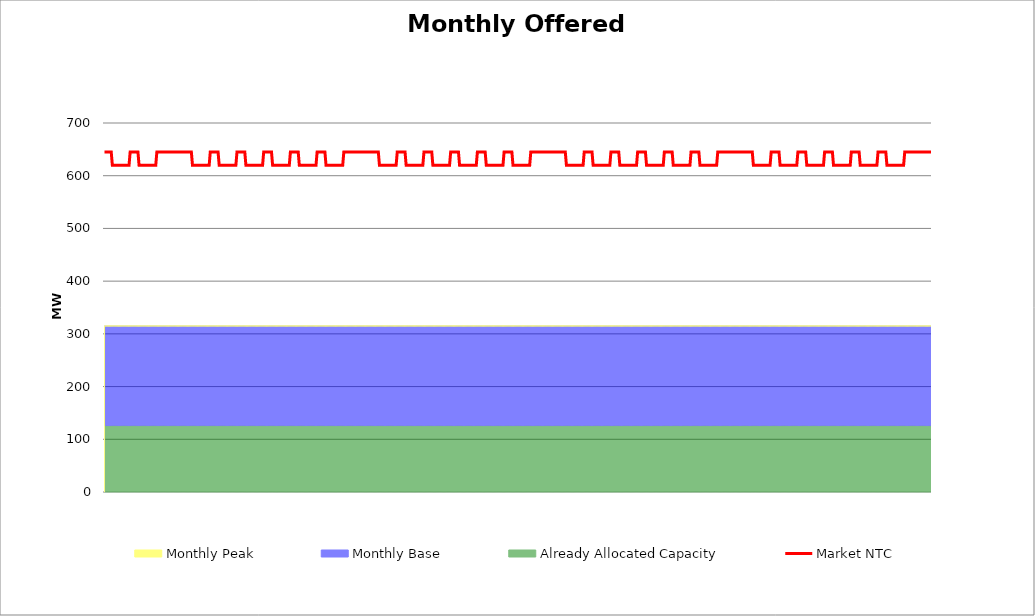
| Category | Market NTC |
|---|---|
| 0 | 645 |
| 1 | 645 |
| 2 | 645 |
| 3 | 645 |
| 4 | 645 |
| 5 | 645 |
| 6 | 645 |
| 7 | 620 |
| 8 | 620 |
| 9 | 620 |
| 10 | 620 |
| 11 | 620 |
| 12 | 620 |
| 13 | 620 |
| 14 | 620 |
| 15 | 620 |
| 16 | 620 |
| 17 | 620 |
| 18 | 620 |
| 19 | 620 |
| 20 | 620 |
| 21 | 620 |
| 22 | 620 |
| 23 | 645 |
| 24 | 645 |
| 25 | 645 |
| 26 | 645 |
| 27 | 645 |
| 28 | 645 |
| 29 | 645 |
| 30 | 645 |
| 31 | 620 |
| 32 | 620 |
| 33 | 620 |
| 34 | 620 |
| 35 | 620 |
| 36 | 620 |
| 37 | 620 |
| 38 | 620 |
| 39 | 620 |
| 40 | 620 |
| 41 | 620 |
| 42 | 620 |
| 43 | 620 |
| 44 | 620 |
| 45 | 620 |
| 46 | 620 |
| 47 | 645 |
| 48 | 645 |
| 49 | 645 |
| 50 | 645 |
| 51 | 645 |
| 52 | 645 |
| 53 | 645 |
| 54 | 645 |
| 55 | 645 |
| 56 | 645 |
| 57 | 645 |
| 58 | 645 |
| 59 | 645 |
| 60 | 645 |
| 61 | 645 |
| 62 | 645 |
| 63 | 645 |
| 64 | 645 |
| 65 | 645 |
| 66 | 645 |
| 67 | 645 |
| 68 | 645 |
| 69 | 645 |
| 70 | 645 |
| 71 | 645 |
| 72 | 645 |
| 73 | 645 |
| 74 | 645 |
| 75 | 645 |
| 76 | 645 |
| 77 | 645 |
| 78 | 645 |
| 79 | 620 |
| 80 | 620 |
| 81 | 620 |
| 82 | 620 |
| 83 | 620 |
| 84 | 620 |
| 85 | 620 |
| 86 | 620 |
| 87 | 620 |
| 88 | 620 |
| 89 | 620 |
| 90 | 620 |
| 91 | 620 |
| 92 | 620 |
| 93 | 620 |
| 94 | 620 |
| 95 | 645 |
| 96 | 645 |
| 97 | 645 |
| 98 | 645 |
| 99 | 645 |
| 100 | 645 |
| 101 | 645 |
| 102 | 645 |
| 103 | 620 |
| 104 | 620 |
| 105 | 620 |
| 106 | 620 |
| 107 | 620 |
| 108 | 620 |
| 109 | 620 |
| 110 | 620 |
| 111 | 620 |
| 112 | 620 |
| 113 | 620 |
| 114 | 620 |
| 115 | 620 |
| 116 | 620 |
| 117 | 620 |
| 118 | 620 |
| 119 | 645 |
| 120 | 645 |
| 121 | 645 |
| 122 | 645 |
| 123 | 645 |
| 124 | 645 |
| 125 | 645 |
| 126 | 645 |
| 127 | 620 |
| 128 | 620 |
| 129 | 620 |
| 130 | 620 |
| 131 | 620 |
| 132 | 620 |
| 133 | 620 |
| 134 | 620 |
| 135 | 620 |
| 136 | 620 |
| 137 | 620 |
| 138 | 620 |
| 139 | 620 |
| 140 | 620 |
| 141 | 620 |
| 142 | 620 |
| 143 | 645 |
| 144 | 645 |
| 145 | 645 |
| 146 | 645 |
| 147 | 645 |
| 148 | 645 |
| 149 | 645 |
| 150 | 645 |
| 151 | 620 |
| 152 | 620 |
| 153 | 620 |
| 154 | 620 |
| 155 | 620 |
| 156 | 620 |
| 157 | 620 |
| 158 | 620 |
| 159 | 620 |
| 160 | 620 |
| 161 | 620 |
| 162 | 620 |
| 163 | 620 |
| 164 | 620 |
| 165 | 620 |
| 166 | 620 |
| 167 | 645 |
| 168 | 645 |
| 169 | 645 |
| 170 | 645 |
| 171 | 645 |
| 172 | 645 |
| 173 | 645 |
| 174 | 645 |
| 175 | 620 |
| 176 | 620 |
| 177 | 620 |
| 178 | 620 |
| 179 | 620 |
| 180 | 620 |
| 181 | 620 |
| 182 | 620 |
| 183 | 620 |
| 184 | 620 |
| 185 | 620 |
| 186 | 620 |
| 187 | 620 |
| 188 | 620 |
| 189 | 620 |
| 190 | 620 |
| 191 | 645 |
| 192 | 645 |
| 193 | 645 |
| 194 | 645 |
| 195 | 645 |
| 196 | 645 |
| 197 | 645 |
| 198 | 645 |
| 199 | 620 |
| 200 | 620 |
| 201 | 620 |
| 202 | 620 |
| 203 | 620 |
| 204 | 620 |
| 205 | 620 |
| 206 | 620 |
| 207 | 620 |
| 208 | 620 |
| 209 | 620 |
| 210 | 620 |
| 211 | 620 |
| 212 | 620 |
| 213 | 620 |
| 214 | 620 |
| 215 | 645 |
| 216 | 645 |
| 217 | 645 |
| 218 | 645 |
| 219 | 645 |
| 220 | 645 |
| 221 | 645 |
| 222 | 645 |
| 223 | 645 |
| 224 | 645 |
| 225 | 645 |
| 226 | 645 |
| 227 | 645 |
| 228 | 645 |
| 229 | 645 |
| 230 | 645 |
| 231 | 645 |
| 232 | 645 |
| 233 | 645 |
| 234 | 645 |
| 235 | 645 |
| 236 | 645 |
| 237 | 645 |
| 238 | 645 |
| 239 | 645 |
| 240 | 645 |
| 241 | 645 |
| 242 | 645 |
| 243 | 645 |
| 244 | 645 |
| 245 | 645 |
| 246 | 645 |
| 247 | 620 |
| 248 | 620 |
| 249 | 620 |
| 250 | 620 |
| 251 | 620 |
| 252 | 620 |
| 253 | 620 |
| 254 | 620 |
| 255 | 620 |
| 256 | 620 |
| 257 | 620 |
| 258 | 620 |
| 259 | 620 |
| 260 | 620 |
| 261 | 620 |
| 262 | 620 |
| 263 | 645 |
| 264 | 645 |
| 265 | 645 |
| 266 | 645 |
| 267 | 645 |
| 268 | 645 |
| 269 | 645 |
| 270 | 645 |
| 271 | 620 |
| 272 | 620 |
| 273 | 620 |
| 274 | 620 |
| 275 | 620 |
| 276 | 620 |
| 277 | 620 |
| 278 | 620 |
| 279 | 620 |
| 280 | 620 |
| 281 | 620 |
| 282 | 620 |
| 283 | 620 |
| 284 | 620 |
| 285 | 620 |
| 286 | 620 |
| 287 | 645 |
| 288 | 645 |
| 289 | 645 |
| 290 | 645 |
| 291 | 645 |
| 292 | 645 |
| 293 | 645 |
| 294 | 645 |
| 295 | 620 |
| 296 | 620 |
| 297 | 620 |
| 298 | 620 |
| 299 | 620 |
| 300 | 620 |
| 301 | 620 |
| 302 | 620 |
| 303 | 620 |
| 304 | 620 |
| 305 | 620 |
| 306 | 620 |
| 307 | 620 |
| 308 | 620 |
| 309 | 620 |
| 310 | 620 |
| 311 | 645 |
| 312 | 645 |
| 313 | 645 |
| 314 | 645 |
| 315 | 645 |
| 316 | 645 |
| 317 | 645 |
| 318 | 645 |
| 319 | 620 |
| 320 | 620 |
| 321 | 620 |
| 322 | 620 |
| 323 | 620 |
| 324 | 620 |
| 325 | 620 |
| 326 | 620 |
| 327 | 620 |
| 328 | 620 |
| 329 | 620 |
| 330 | 620 |
| 331 | 620 |
| 332 | 620 |
| 333 | 620 |
| 334 | 620 |
| 335 | 645 |
| 336 | 645 |
| 337 | 645 |
| 338 | 645 |
| 339 | 645 |
| 340 | 645 |
| 341 | 645 |
| 342 | 645 |
| 343 | 620 |
| 344 | 620 |
| 345 | 620 |
| 346 | 620 |
| 347 | 620 |
| 348 | 620 |
| 349 | 620 |
| 350 | 620 |
| 351 | 620 |
| 352 | 620 |
| 353 | 620 |
| 354 | 620 |
| 355 | 620 |
| 356 | 620 |
| 357 | 620 |
| 358 | 620 |
| 359 | 645 |
| 360 | 645 |
| 361 | 645 |
| 362 | 645 |
| 363 | 645 |
| 364 | 645 |
| 365 | 645 |
| 366 | 645 |
| 367 | 620 |
| 368 | 620 |
| 369 | 620 |
| 370 | 620 |
| 371 | 620 |
| 372 | 620 |
| 373 | 620 |
| 374 | 620 |
| 375 | 620 |
| 376 | 620 |
| 377 | 620 |
| 378 | 620 |
| 379 | 620 |
| 380 | 620 |
| 381 | 620 |
| 382 | 620 |
| 383 | 645 |
| 384 | 645 |
| 385 | 645 |
| 386 | 645 |
| 387 | 645 |
| 388 | 645 |
| 389 | 645 |
| 390 | 645 |
| 391 | 645 |
| 392 | 645 |
| 393 | 645 |
| 394 | 645 |
| 395 | 645 |
| 396 | 645 |
| 397 | 645 |
| 398 | 645 |
| 399 | 645 |
| 400 | 645 |
| 401 | 645 |
| 402 | 645 |
| 403 | 645 |
| 404 | 645 |
| 405 | 645 |
| 406 | 645 |
| 407 | 645 |
| 408 | 645 |
| 409 | 645 |
| 410 | 645 |
| 411 | 645 |
| 412 | 645 |
| 413 | 645 |
| 414 | 645 |
| 415 | 620 |
| 416 | 620 |
| 417 | 620 |
| 418 | 620 |
| 419 | 620 |
| 420 | 620 |
| 421 | 620 |
| 422 | 620 |
| 423 | 620 |
| 424 | 620 |
| 425 | 620 |
| 426 | 620 |
| 427 | 620 |
| 428 | 620 |
| 429 | 620 |
| 430 | 620 |
| 431 | 645 |
| 432 | 645 |
| 433 | 645 |
| 434 | 645 |
| 435 | 645 |
| 436 | 645 |
| 437 | 645 |
| 438 | 645 |
| 439 | 620 |
| 440 | 620 |
| 441 | 620 |
| 442 | 620 |
| 443 | 620 |
| 444 | 620 |
| 445 | 620 |
| 446 | 620 |
| 447 | 620 |
| 448 | 620 |
| 449 | 620 |
| 450 | 620 |
| 451 | 620 |
| 452 | 620 |
| 453 | 620 |
| 454 | 620 |
| 455 | 645 |
| 456 | 645 |
| 457 | 645 |
| 458 | 645 |
| 459 | 645 |
| 460 | 645 |
| 461 | 645 |
| 462 | 645 |
| 463 | 620 |
| 464 | 620 |
| 465 | 620 |
| 466 | 620 |
| 467 | 620 |
| 468 | 620 |
| 469 | 620 |
| 470 | 620 |
| 471 | 620 |
| 472 | 620 |
| 473 | 620 |
| 474 | 620 |
| 475 | 620 |
| 476 | 620 |
| 477 | 620 |
| 478 | 620 |
| 479 | 645 |
| 480 | 645 |
| 481 | 645 |
| 482 | 645 |
| 483 | 645 |
| 484 | 645 |
| 485 | 645 |
| 486 | 645 |
| 487 | 620 |
| 488 | 620 |
| 489 | 620 |
| 490 | 620 |
| 491 | 620 |
| 492 | 620 |
| 493 | 620 |
| 494 | 620 |
| 495 | 620 |
| 496 | 620 |
| 497 | 620 |
| 498 | 620 |
| 499 | 620 |
| 500 | 620 |
| 501 | 620 |
| 502 | 620 |
| 503 | 645 |
| 504 | 645 |
| 505 | 645 |
| 506 | 645 |
| 507 | 645 |
| 508 | 645 |
| 509 | 645 |
| 510 | 645 |
| 511 | 620 |
| 512 | 620 |
| 513 | 620 |
| 514 | 620 |
| 515 | 620 |
| 516 | 620 |
| 517 | 620 |
| 518 | 620 |
| 519 | 620 |
| 520 | 620 |
| 521 | 620 |
| 522 | 620 |
| 523 | 620 |
| 524 | 620 |
| 525 | 620 |
| 526 | 620 |
| 527 | 645 |
| 528 | 645 |
| 529 | 645 |
| 530 | 645 |
| 531 | 645 |
| 532 | 645 |
| 533 | 645 |
| 534 | 645 |
| 535 | 620 |
| 536 | 620 |
| 537 | 620 |
| 538 | 620 |
| 539 | 620 |
| 540 | 620 |
| 541 | 620 |
| 542 | 620 |
| 543 | 620 |
| 544 | 620 |
| 545 | 620 |
| 546 | 620 |
| 547 | 620 |
| 548 | 620 |
| 549 | 620 |
| 550 | 620 |
| 551 | 645 |
| 552 | 645 |
| 553 | 645 |
| 554 | 645 |
| 555 | 645 |
| 556 | 645 |
| 557 | 645 |
| 558 | 645 |
| 559 | 645 |
| 560 | 645 |
| 561 | 645 |
| 562 | 645 |
| 563 | 645 |
| 564 | 645 |
| 565 | 645 |
| 566 | 645 |
| 567 | 645 |
| 568 | 645 |
| 569 | 645 |
| 570 | 645 |
| 571 | 645 |
| 572 | 645 |
| 573 | 645 |
| 574 | 645 |
| 575 | 645 |
| 576 | 645 |
| 577 | 645 |
| 578 | 645 |
| 579 | 645 |
| 580 | 645 |
| 581 | 645 |
| 582 | 645 |
| 583 | 620 |
| 584 | 620 |
| 585 | 620 |
| 586 | 620 |
| 587 | 620 |
| 588 | 620 |
| 589 | 620 |
| 590 | 620 |
| 591 | 620 |
| 592 | 620 |
| 593 | 620 |
| 594 | 620 |
| 595 | 620 |
| 596 | 620 |
| 597 | 620 |
| 598 | 620 |
| 599 | 645 |
| 600 | 645 |
| 601 | 645 |
| 602 | 645 |
| 603 | 645 |
| 604 | 645 |
| 605 | 645 |
| 606 | 645 |
| 607 | 620 |
| 608 | 620 |
| 609 | 620 |
| 610 | 620 |
| 611 | 620 |
| 612 | 620 |
| 613 | 620 |
| 614 | 620 |
| 615 | 620 |
| 616 | 620 |
| 617 | 620 |
| 618 | 620 |
| 619 | 620 |
| 620 | 620 |
| 621 | 620 |
| 622 | 620 |
| 623 | 645 |
| 624 | 645 |
| 625 | 645 |
| 626 | 645 |
| 627 | 645 |
| 628 | 645 |
| 629 | 645 |
| 630 | 645 |
| 631 | 620 |
| 632 | 620 |
| 633 | 620 |
| 634 | 620 |
| 635 | 620 |
| 636 | 620 |
| 637 | 620 |
| 638 | 620 |
| 639 | 620 |
| 640 | 620 |
| 641 | 620 |
| 642 | 620 |
| 643 | 620 |
| 644 | 620 |
| 645 | 620 |
| 646 | 620 |
| 647 | 645 |
| 648 | 645 |
| 649 | 645 |
| 650 | 645 |
| 651 | 645 |
| 652 | 645 |
| 653 | 645 |
| 654 | 645 |
| 655 | 620 |
| 656 | 620 |
| 657 | 620 |
| 658 | 620 |
| 659 | 620 |
| 660 | 620 |
| 661 | 620 |
| 662 | 620 |
| 663 | 620 |
| 664 | 620 |
| 665 | 620 |
| 666 | 620 |
| 667 | 620 |
| 668 | 620 |
| 669 | 620 |
| 670 | 620 |
| 671 | 645 |
| 672 | 645 |
| 673 | 645 |
| 674 | 645 |
| 675 | 645 |
| 676 | 645 |
| 677 | 645 |
| 678 | 645 |
| 679 | 620 |
| 680 | 620 |
| 681 | 620 |
| 682 | 620 |
| 683 | 620 |
| 684 | 620 |
| 685 | 620 |
| 686 | 620 |
| 687 | 620 |
| 688 | 620 |
| 689 | 620 |
| 690 | 620 |
| 691 | 620 |
| 692 | 620 |
| 693 | 620 |
| 694 | 620 |
| 695 | 645 |
| 696 | 645 |
| 697 | 645 |
| 698 | 645 |
| 699 | 645 |
| 700 | 645 |
| 701 | 645 |
| 702 | 645 |
| 703 | 620 |
| 704 | 620 |
| 705 | 620 |
| 706 | 620 |
| 707 | 620 |
| 708 | 620 |
| 709 | 620 |
| 710 | 620 |
| 711 | 620 |
| 712 | 620 |
| 713 | 620 |
| 714 | 620 |
| 715 | 620 |
| 716 | 620 |
| 717 | 620 |
| 718 | 620 |
| 719 | 645 |
| 720 | 645 |
| 721 | 645 |
| 722 | 645 |
| 723 | 645 |
| 724 | 645 |
| 725 | 645 |
| 726 | 645 |
| 727 | 645 |
| 728 | 645 |
| 729 | 645 |
| 730 | 645 |
| 731 | 645 |
| 732 | 645 |
| 733 | 645 |
| 734 | 645 |
| 735 | 645 |
| 736 | 645 |
| 737 | 645 |
| 738 | 645 |
| 739 | 645 |
| 740 | 645 |
| 741 | 645 |
| 742 | 645 |
| 743 | 645 |